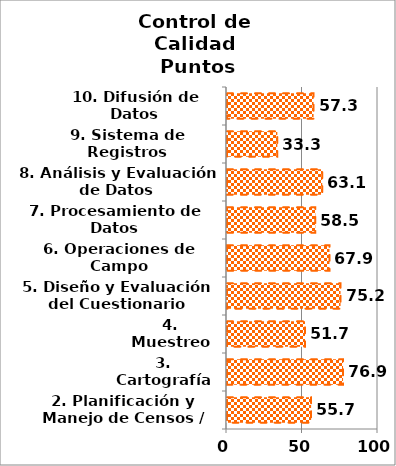
| Category | Series 0 |
|---|---|
| 2. Planificación y Manejo de Censos / Encuestas | 55.694 |
| 3. Cartografía | 76.852 |
| 4. Muestreo | 51.667 |
| 5. Diseño y Evaluación del Cuestionario | 75.203 |
| 6. Operaciones de Campo | 67.857 |
| 7. Procesamiento de Datos | 58.519 |
| 8. Análisis y Evaluación de Datos | 63.077 |
| 9. Sistema de Registros Administrativos | 33.333 |
| 10. Difusión de Datos | 57.325 |